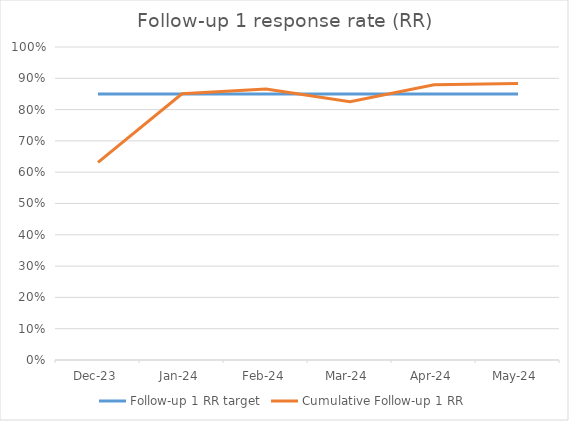
| Category | Follow-up 1 RR target | Cumulative Follow-up 1 RR |
|---|---|---|
| Dec-23 | 0.85 | 0.632 |
| Jan-24 | 0.85 | 0.851 |
| Feb-24 | 0.85 | 0.866 |
| Mar-24 | 0.85 | 0.825 |
| Apr-24 | 0.85 | 0.88 |
| May-24 | 0.85 | 0.883 |